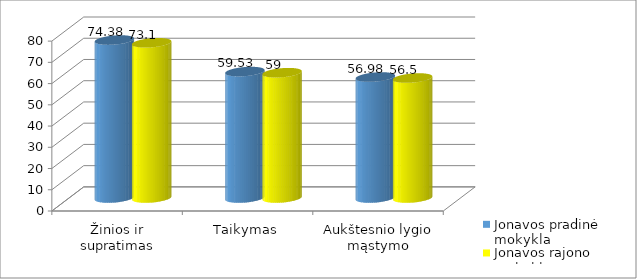
| Category | Jonavos pradinė mokykla | Jonavos rajono mokyklos |
|---|---|---|
| Žinios ir supratimas | 74.38 | 73.1 |
| Taikymas | 59.53 | 59 |
| Aukštesnio lygio mąstymo gebėjimai | 56.98 | 56.5 |